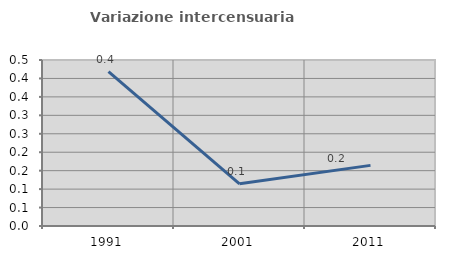
| Category | Variazione intercensuaria annua |
|---|---|
| 1991.0 | 0.418 |
| 2001.0 | 0.114 |
| 2011.0 | 0.164 |